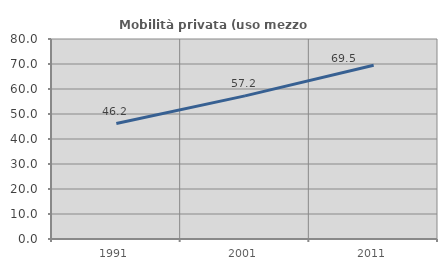
| Category | Mobilità privata (uso mezzo privato) |
|---|---|
| 1991.0 | 46.193 |
| 2001.0 | 57.247 |
| 2011.0 | 69.473 |